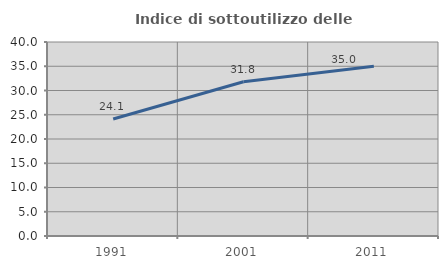
| Category | Indice di sottoutilizzo delle abitazioni  |
|---|---|
| 1991.0 | 24.126 |
| 2001.0 | 31.801 |
| 2011.0 | 34.984 |